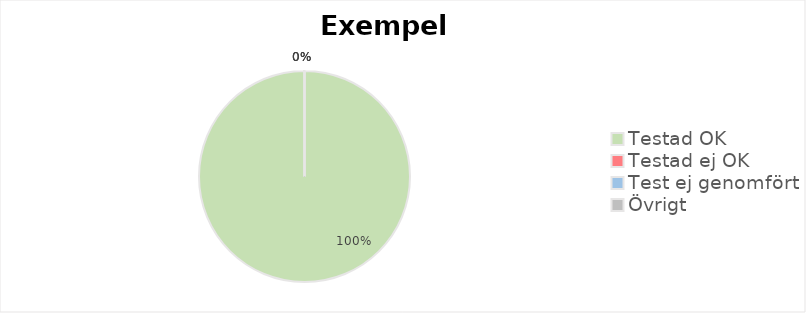
| Category | Series 0 |
|---|---|
| Testad OK | 3 |
| Testad ej OK | 0 |
| Test ej genomfört | 0 |
| Övrigt | 0 |